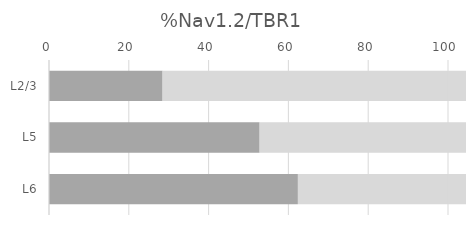
| Category | Series 2 | Series 3 | Series 0 | Series 1 |
|---|---|---|---|---|
| L2/3 | 28.467 | 71.533 | 69.246 | 30.754 |
| L5 | 52.787 | 47.213 | 68.945 | 31.055 |
| L6 | 62.381 | 37.619 | 68.679 | 31.321 |